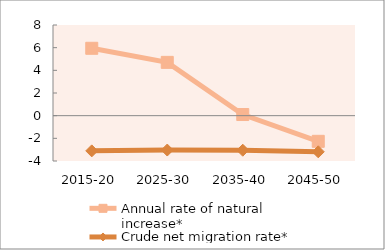
| Category | Annual rate of natural increase* | Crude net migration rate* |
|---|---|---|
| 2015-20 | 5.945 | -3.106 |
| 2025-30 | 4.703 | -3.033 |
| 2035-40 | 0.101 | -3.05 |
| 2045-50 | -2.264 | -3.188 |